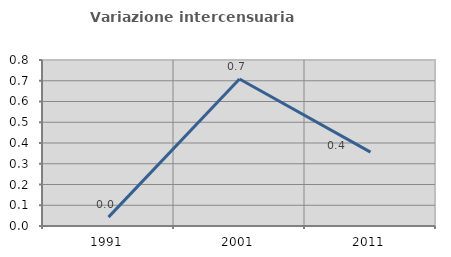
| Category | Variazione intercensuaria annua |
|---|---|
| 1991.0 | 0.043 |
| 2001.0 | 0.709 |
| 2011.0 | 0.356 |